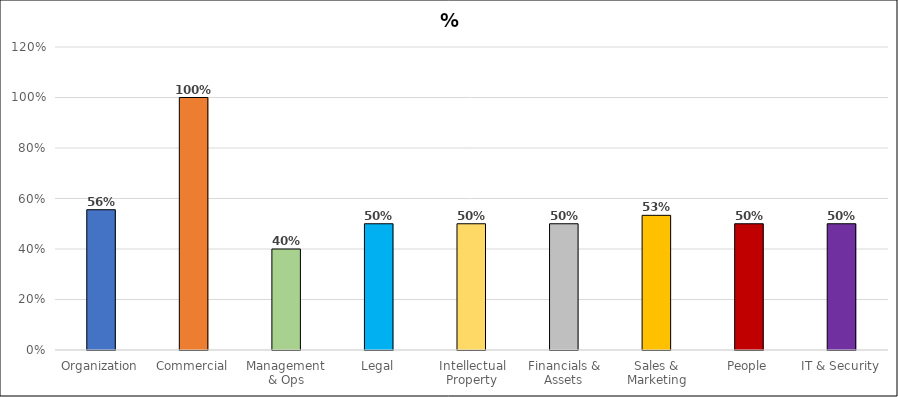
| Category | Series 0 |
|---|---|
| Organization | 0.556 |
| Commercial | 1 |
| Management & Ops | 0.4 |
| Legal | 0.5 |
| Intellectual Property | 0.5 |
| Financials & Assets | 0.5 |
| Sales & Marketing | 0.533 |
| People | 0.5 |
| IT & Security | 0.5 |